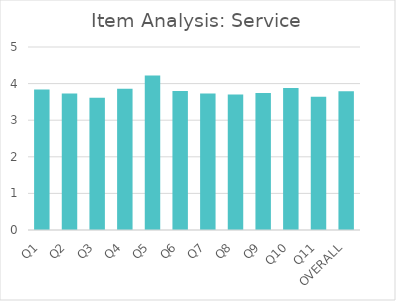
| Category | Series 0 |
|---|---|
| Q1 | 3.84 |
| Q2 | 3.73 |
| Q3 | 3.61 |
| Q4 | 3.86 |
| Q5 | 4.22 |
| Q6 | 3.8 |
| Q7 | 3.73 |
| Q8 | 3.7 |
| Q9 | 3.74 |
| Q10 | 3.88 |
| Q11 | 3.64 |
| OVERALL | 3.79 |